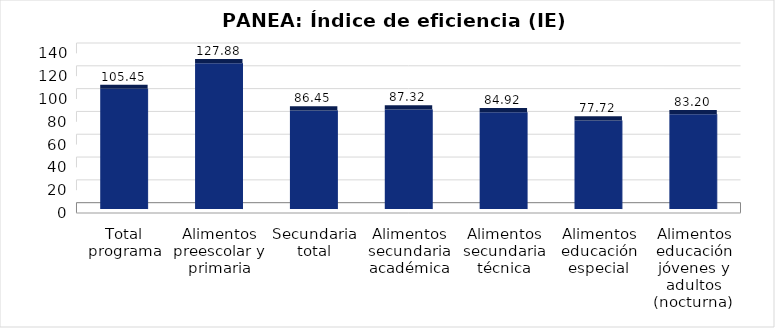
| Category | Índice de eficiencia (IE)  |
|---|---|
| Total programa | 105.446 |
| Alimentos preescolar y primaria | 127.879 |
| Secundaria total | 86.454 |
| Alimentos secundaria académica | 87.321 |
| Alimentos secundaria técnica | 84.918 |
| Alimentos educación especial | 77.72 |
| Alimentos educación jóvenes y adultos (nocturna)  | 83.203 |